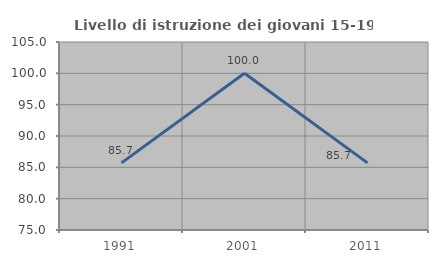
| Category | Livello di istruzione dei giovani 15-19 anni |
|---|---|
| 1991.0 | 85.714 |
| 2001.0 | 100 |
| 2011.0 | 85.714 |